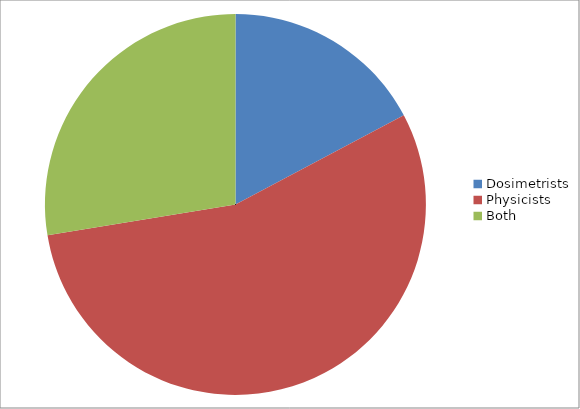
| Category | Series 0 |
|---|---|
| Dosimetrists | 5 |
| Physicists | 16 |
| Both | 8 |